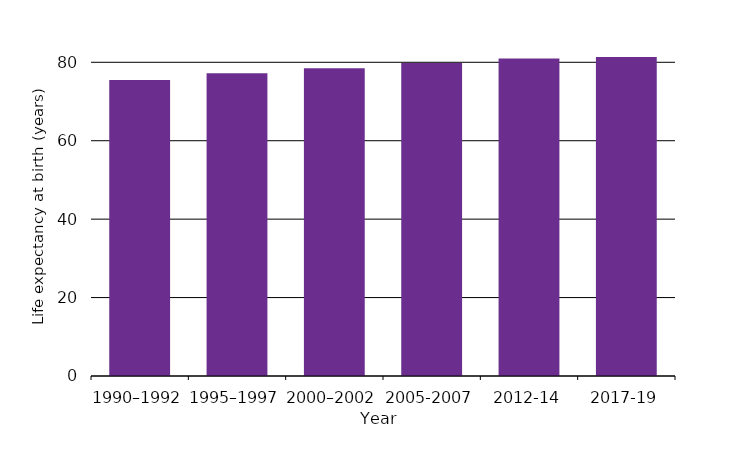
| Category | Life expectancy at birth (years) |
|---|---|
| 1990–1992 | 75.5 |
| 1995–1997 | 77.2 |
| 2000–2002 | 78.5 |
| 2005-2007 | 79.8 |
| 2012-14 | 80.95 |
| 2017-19 | 81.35 |